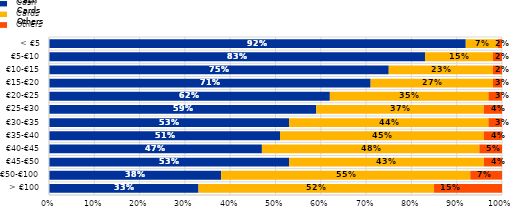
| Category | Cash | Cards | Others |
|---|---|---|---|
| > €100 | 0.33 | 0.52 | 0.15 |
| €50-€100 | 0.38 | 0.55 | 0.07 |
| €45-€50 | 0.53 | 0.43 | 0.04 |
| €40-€45 | 0.47 | 0.48 | 0.05 |
| €35-€40 | 0.51 | 0.45 | 0.04 |
| €30-€35 | 0.53 | 0.44 | 0.03 |
| €25-€30 | 0.59 | 0.37 | 0.04 |
| €20-€25 | 0.62 | 0.35 | 0.03 |
| €15-€20 | 0.71 | 0.27 | 0.03 |
| €10-€15 | 0.75 | 0.23 | 0.02 |
| €5-€10 | 0.83 | 0.15 | 0.02 |
| < €5 | 0.92 | 0.07 | 0.02 |